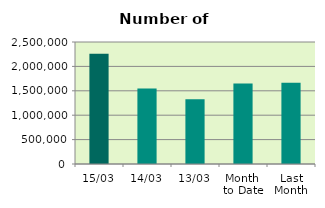
| Category | Series 0 |
|---|---|
| 15/03 | 2258068 |
| 14/03 | 1545466 |
| 13/03 | 1326100 |
| Month 
to Date | 1651520 |
| Last
Month | 1666801.1 |